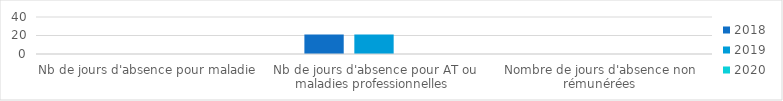
| Category | 2018 | 2019 | 2020 |
|---|---|---|---|
| Nb de jours d'absence pour maladie | 0 | 0 | 0 |
| Nb de jours d'absence pour AT ou maladies professionnelles  | 21 | 21 | 0 |
| Nombre de jours d'absence non rémunérées | 0 | 0 | 0 |